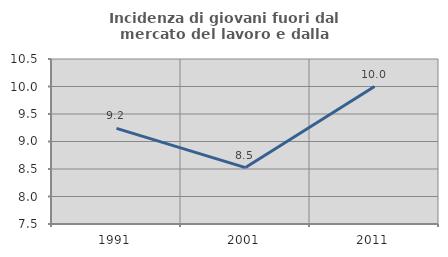
| Category | Incidenza di giovani fuori dal mercato del lavoro e dalla formazione  |
|---|---|
| 1991.0 | 9.238 |
| 2001.0 | 8.526 |
| 2011.0 | 10 |